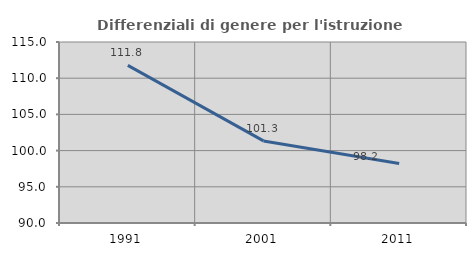
| Category | Differenziali di genere per l'istruzione superiore |
|---|---|
| 1991.0 | 111.771 |
| 2001.0 | 101.337 |
| 2011.0 | 98.211 |